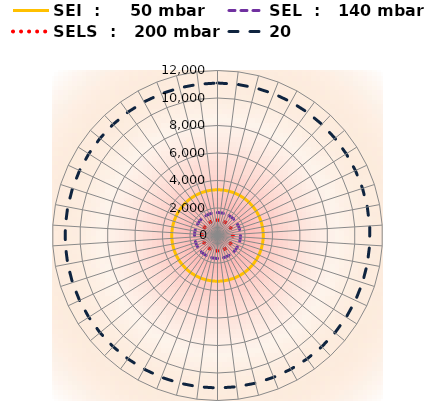
| Category | SEI  :     50 mbar | SEL  :   140 mbar | SELS  :   200 mbar | 20 |
|---|---|---|---|---|
| 1 | 3330 | 1670 | 1110 | 11090 |
| 2 | 3330 | 1670 | 1110 | 11090 |
| 3 | 3330 | 1670 | 1110 | 11090 |
| 4 | 3330 | 1670 | 1110 | 11090 |
| 5 | 3330 | 1670 | 1110 | 11090 |
| 6 | 3330 | 1670 | 1110 | 11090 |
| 7 | 3330 | 1670 | 1110 | 11090 |
| 8 | 3330 | 1670 | 1110 | 11090 |
| 9 | 3330 | 1670 | 1110 | 11090 |
| 10 | 3330 | 1670 | 1110 | 11090 |
| 11 | 3330 | 1670 | 1110 | 11090 |
| 12 | 3330 | 1670 | 1110 | 11090 |
| 13 | 3330 | 1670 | 1110 | 11090 |
| 14 | 3330 | 1670 | 1110 | 11090 |
| 15 | 3330 | 1670 | 1110 | 11090 |
| 16 | 3330 | 1670 | 1110 | 11090 |
| 17 | 3330 | 1670 | 1110 | 11090 |
| 18 | 3330 | 1670 | 1110 | 11090 |
| 19 | 3330 | 1670 | 1110 | 11090 |
| 20 | 3330 | 1670 | 1110 | 11090 |
| 21 | 3330 | 1670 | 1110 | 11090 |
| 22 | 3330 | 1670 | 1110 | 11090 |
| 23 | 3330 | 1670 | 1110 | 11090 |
| 24 | 3330 | 1670 | 1110 | 11090 |
| 25 | 3330 | 1670 | 1110 | 11090 |
| 26 | 3330 | 1670 | 1110 | 11090 |
| 27 | 3330 | 1670 | 1110 | 11090 |
| 28 | 3330 | 1670 | 1110 | 11090 |
| 29 | 3330 | 1670 | 1110 | 11090 |
| 30 | 3330 | 1670 | 1110 | 11090 |
| 31 | 3330 | 1670 | 1110 | 11090 |
| 32 | 3330 | 1670 | 1110 | 11090 |
| 33 | 3330 | 1670 | 1110 | 11090 |
| 34 | 3330 | 1670 | 1110 | 11090 |
| 35 | 3330 | 1670 | 1110 | 11090 |
| 36 | 3330 | 1670 | 1110 | 11090 |
| 37 | 3330 | 1670 | 1110 | 11090 |
| 38 | 3330 | 1670 | 1110 | 11090 |
| 39 | 3330 | 1670 | 1110 | 11090 |
| 40 | 3330 | 1670 | 1110 | 11090 |
| 41 | 3330 | 1670 | 1110 | 11090 |
| 42 | 3330 | 1670 | 1110 | 11090 |
| 43 | 3330 | 1670 | 1110 | 11090 |
| 44 | 3330 | 1670 | 1110 | 11090 |
| 45 | 3330 | 1670 | 1110 | 11090 |
| 46 | 3330 | 1670 | 1110 | 11090 |
| 47 | 3330 | 1670 | 1110 | 11090 |
| 48 | 3330 | 1670 | 1110 | 11090 |
| 49 | 3330 | 1670 | 1110 | 11090 |
| 50 | 3330 | 1670 | 1110 | 11090 |